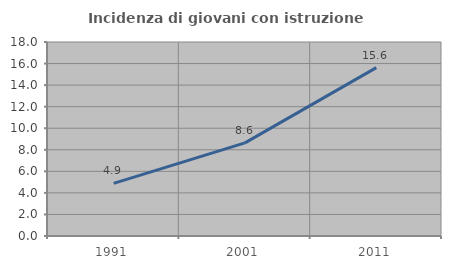
| Category | Incidenza di giovani con istruzione universitaria |
|---|---|
| 1991.0 | 4.878 |
| 2001.0 | 8.642 |
| 2011.0 | 15.625 |